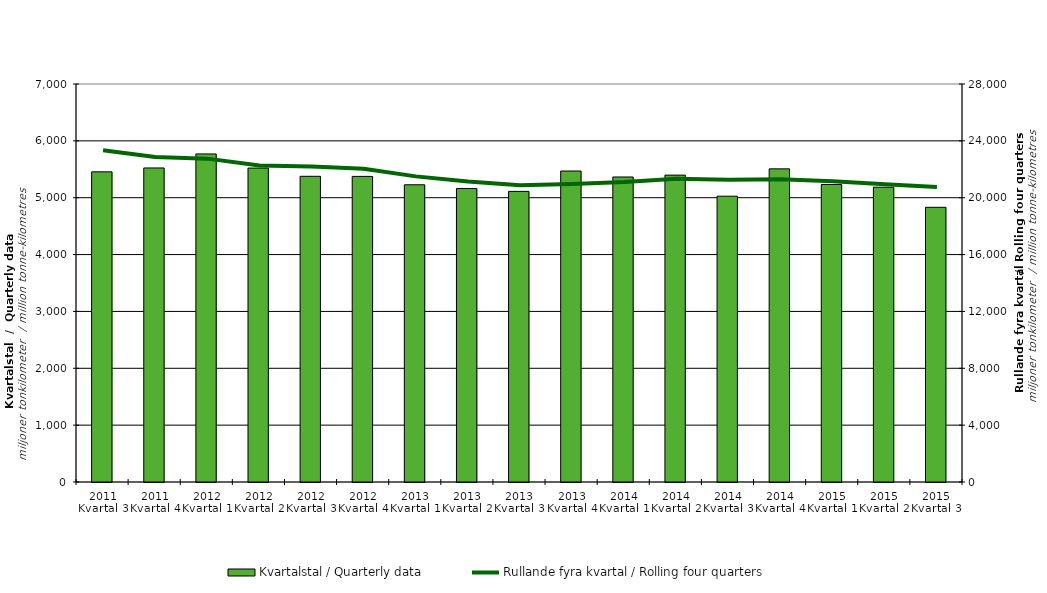
| Category | Kvartalstal / Quarterly data |
|---|---|
| 2011 Kvartal 3 | 5455.125 |
| 2011 Kvartal 4 | 5523.171 |
| 2012 Kvartal 1 | 5769.724 |
| 2012 Kvartal 2 | 5521.307 |
| 2012 Kvartal 3 | 5376.578 |
| 2012 Kvartal 4 | 5375.031 |
| 2013 Kvartal 1 | 5227.648 |
| 2013 Kvartal 2 | 5161.772 |
| 2013 Kvartal 3 | 5111.013 |
| 2013 Kvartal 4 | 5469.542 |
| 2014 Kvartal 1 | 5364.578 |
| 2014 Kvartal 2 | 5397.475 |
| 2014 Kvartal 3 | 5026.729 |
| 2014 Kvartal 4 | 5507.547 |
| 2015 Kvartal 1 | 5232.245 |
| 2015 Kvartal 2 | 5184.883 |
| 2015 Kvartal 3 | 4831.324 |